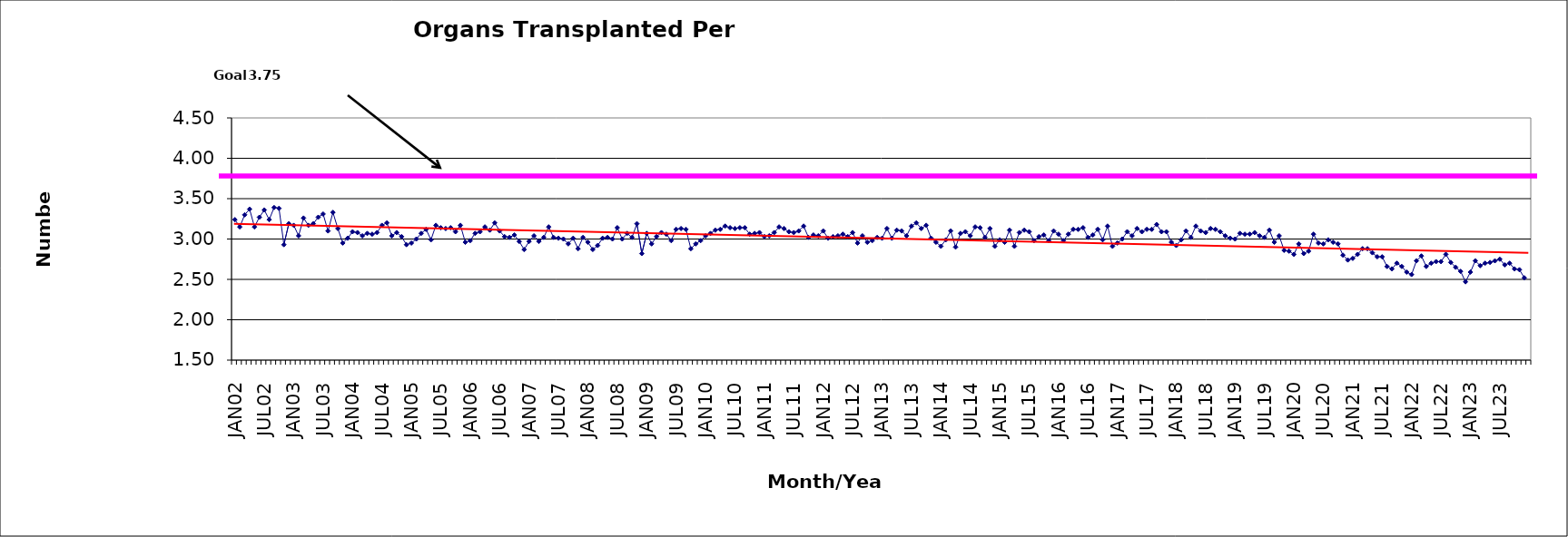
| Category | Series 0 |
|---|---|
| JAN02 | 3.24 |
| FEB02 | 3.15 |
| MAR02 | 3.3 |
| APR02 | 3.37 |
| MAY02 | 3.15 |
| JUN02 | 3.27 |
| JUL02 | 3.36 |
| AUG02 | 3.24 |
| SEP02 | 3.39 |
| OCT02 | 3.38 |
| NOV02 | 2.93 |
| DEC02 | 3.19 |
| JAN03 | 3.17 |
| FEB03 | 3.04 |
| MAR03 | 3.26 |
| APR03 | 3.17 |
| MAY03 | 3.19 |
| JUN03 | 3.27 |
| JUL03 | 3.31 |
| AUG03 | 3.1 |
| SEP03 | 3.33 |
| OCT03 | 3.13 |
| NOV03 | 2.95 |
| DEC03 | 3.01 |
| JAN04 | 3.09 |
| FEB04 | 3.08 |
| MAR04 | 3.04 |
| APR04 | 3.07 |
| MAY04 | 3.06 |
| JUN04 | 3.08 |
| JUL04 | 3.17 |
| AUG04 | 3.2 |
| SEP04 | 3.04 |
| OCT04 | 3.08 |
| NOV04 | 3.03 |
| DEC04 | 2.93 |
| JAN05 | 2.95 |
| FEB05 | 3 |
| MAR05 | 3.07 |
| APR05 | 3.12 |
| MAY05 | 2.99 |
| JUN05 | 3.17 |
| JUL05 | 3.14 |
| AUG05 | 3.13 |
| SEP05 | 3.14 |
| OCT05 | 3.09 |
| NOV05 | 3.17 |
| DEC05 | 2.96 |
| JAN06 | 2.98 |
| FEB06 | 3.07 |
| MAR06 | 3.09 |
| APR06 | 3.15 |
| MAY06 | 3.11 |
| JUN06 | 3.2 |
| JUL06 | 3.1 |
| AUG06 | 3.03 |
| SEP06 | 3.02 |
| OCT06 | 3.05 |
| NOV06 | 2.97 |
| DEC06 | 2.87 |
| JAN07 | 2.97 |
| FEB07 | 3.04 |
| MAR07 | 2.97 |
| APR07 | 3.02 |
| MAY07 | 3.15 |
| JUN07 | 3.02 |
| JUL07 | 3.01 |
| AUG07 | 3 |
| SEP07 | 2.94 |
| OCT07 | 3.01 |
| NOV07 | 2.88 |
| DEC07 | 3.02 |
| JAN08 | 2.96 |
| FEB08 | 2.87 |
| MAR08 | 2.92 |
| APR08 | 3.01 |
| MAY08 | 3.02 |
| JUN08 | 3 |
| JUL08 | 3.14 |
| AUG08 | 3 |
| SEP08 | 3.07 |
| OCT08 | 3.02 |
| NOV08 | 3.19 |
| DEC08 | 2.82 |
| JAN09 | 3.07 |
| FEB09 | 2.94 |
| MAR09 | 3.03 |
| APR09 | 3.08 |
| MAY09 | 3.06 |
| JUN09 | 2.98 |
| JUL09 | 3.12 |
| AUG09 | 3.13 |
| SEP09 | 3.12 |
| OCT09 | 2.88 |
| NOV09 | 2.94 |
| DEC09 | 2.98 |
| JAN10 | 3.04 |
| FEB10 | 3.07 |
| MAR10 | 3.11 |
| APR10 | 3.12 |
| MAY10 | 3.16 |
| JUN10 | 3.14 |
| JUL10 | 3.13 |
| AUG10 | 3.14 |
| SEP10 | 3.14 |
| OCT10 | 3.06 |
| NOV10 | 3.07 |
| DEC10 | 3.08 |
| JAN11 | 3.03 |
| FEB11 | 3.04 |
| MAR11 | 3.08 |
| APR11 | 3.15 |
| MAY11 | 3.13 |
| JUN11 | 3.09 |
| JUL11 | 3.08 |
| AUG11 | 3.1 |
| SEP11 | 3.16 |
| OCT11 | 3.02 |
| NOV11 | 3.05 |
| DEC11 | 3.04 |
| JAN12 | 3.1 |
| FEB12 | 3.01 |
| MAR12 | 3.03 |
| APR12 | 3.04 |
| MAY12 | 3.06 |
| JUN12 | 3.03 |
| JUL12 | 3.08 |
| AUG12 | 2.95 |
| SEP12 | 3.04 |
| OCT12 | 2.96 |
| NOV12 | 2.98 |
| DEC12 | 3.02 |
| JAN13 | 3.01 |
| FEB13 | 3.13 |
| MAR13 | 3.01 |
| APR13 | 3.11 |
| MAY13 | 3.1 |
| JUN13 | 3.04 |
| JUL13 | 3.16 |
| AUG13 | 3.2 |
| SEP13 | 3.13 |
| OCT13 | 3.17 |
| NOV13 | 3.01 |
| DEC13 | 2.96 |
| JAN14 | 2.91 |
| FEB14 | 2.99 |
| MAR14 | 3.1 |
| APR14 | 2.9 |
| MAY14 | 3.07 |
| JUN14 | 3.09 |
| JUL14 | 3.04 |
| AUG14 | 3.15 |
| SEP14 | 3.14 |
| OCT14 | 3.02 |
| NOV14 | 3.13 |
| DEC14 | 2.91 |
| JAN15 | 2.99 |
| FEB15 | 2.96 |
| MAR15 | 3.11 |
| APR15 | 2.91 |
| MAY15 | 3.08 |
| JUN15 | 3.11 |
| JUL15 | 3.09 |
| AUG15 | 2.98 |
| SEP15 | 3.03 |
| OCT15 | 3.05 |
| NOV15 | 2.98 |
| DEC15 | 3.1 |
| JAN16 | 3.06 |
| FEB16 | 2.98 |
| MAR16 | 3.06 |
| APR16 | 3.12 |
| MAY16 | 3.12 |
| JUN16 | 3.14 |
| JUL16 | 3.02 |
| AUG16 | 3.05 |
| SEP16 | 3.12 |
| OCT16 | 2.99 |
| NOV16 | 3.16 |
| DEC16 | 2.91 |
| JAN17 | 2.95 |
| FEB17 | 3 |
| MAR17 | 3.09 |
| APR17 | 3.04 |
| MAY17 | 3.13 |
| JUN17 | 3.09 |
| JUL17 | 3.12 |
| AUG17 | 3.12 |
| SEP17 | 3.18 |
| OCT17 | 3.09 |
| NOV17 | 3.09 |
| DEC17 | 2.96 |
| JAN18 | 2.92 |
| FEB18 | 2.99 |
| MAR18 | 3.1 |
| APR18 | 3.02 |
| MAY18 | 3.16 |
| JUN18 | 3.1 |
| JUL18 | 3.08 |
| AUG18 | 3.13 |
| SEP18 | 3.12 |
| OCT18 | 3.09 |
| NOV18 | 3.04 |
| DEC18 | 3.01 |
| JAN19 | 3 |
| FEB19 | 3.07 |
| MAR19 | 3.06 |
| APR19 | 3.06 |
| MAY19 | 3.08 |
| JUN19 | 3.04 |
| JUL19 | 3.02 |
| AUG19 | 3.11 |
| SEP19 | 2.96 |
| OCT19 | 3.04 |
| NOV19 | 2.86 |
| DEC19 | 2.85 |
| JAN20 | 2.81 |
| FEB20 | 2.94 |
| MAR20 | 2.82 |
| APR20 | 2.85 |
| MAY20 | 3.06 |
| JUN20 | 2.95 |
| JUL20 | 2.94 |
| AUG20 | 2.99 |
| SEP20 | 2.96 |
| OCT20 | 2.94 |
| NOV20 | 2.8 |
| DEC20 | 2.74 |
| JAN21 | 2.76 |
| FEB21 | 2.81 |
| MAR21 | 2.88 |
| APR21 | 2.88 |
| MAY21 | 2.83 |
| JUN21 | 2.78 |
| JUL21 | 2.78 |
| AUG21 | 2.66 |
| SEP21 | 2.63 |
| OCT21 | 2.7 |
| NOV21 | 2.66 |
| DEC21 | 2.59 |
| JAN22 | 2.56 |
| FEB22 | 2.73 |
| MAR22 | 2.79 |
| APR22 | 2.66 |
| MAY22 | 2.7 |
| JUN22 | 2.72 |
| JUL22 | 2.72 |
| AUG22 | 2.81 |
| SEP22 | 2.71 |
| OCT22 | 2.65 |
| NOV22 | 2.6 |
| DEC22 | 2.47 |
| JAN23 | 2.59 |
| FEB23 | 2.73 |
| MAR23 | 2.67 |
| APR23 | 2.7 |
| MAY23 | 2.71 |
| JUN23 | 2.73 |
| JUL23 | 2.75 |
| AUG23 | 2.68 |
| SEP23 | 2.7 |
| OCT23 | 2.63 |
| NOV23 | 2.62 |
| DEC23 | 2.52 |